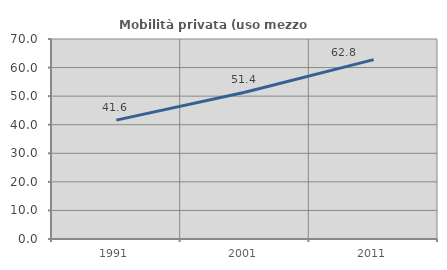
| Category | Mobilità privata (uso mezzo privato) |
|---|---|
| 1991.0 | 41.605 |
| 2001.0 | 51.378 |
| 2011.0 | 62.776 |